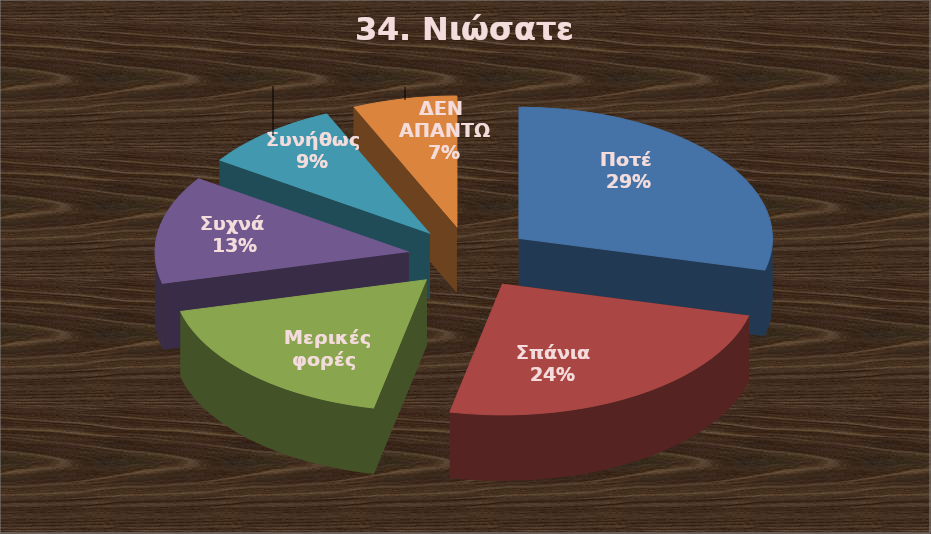
| Category | Series 0 |
|---|---|
| Ποτέ  | 13 |
| Σπάνια  | 11 |
| Μερικές φορές  | 8 |
| Συχνά  | 6 |
| Συνήθως  | 4 |
| ΔΕΝ ΑΠΑΝΤΩ | 3 |